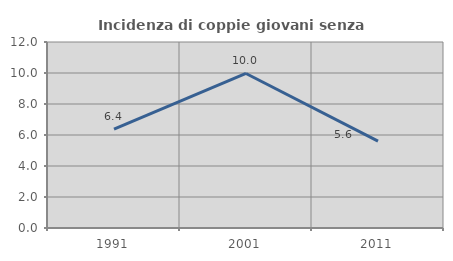
| Category | Incidenza di coppie giovani senza figli |
|---|---|
| 1991.0 | 6.378 |
| 2001.0 | 9.97 |
| 2011.0 | 5.607 |